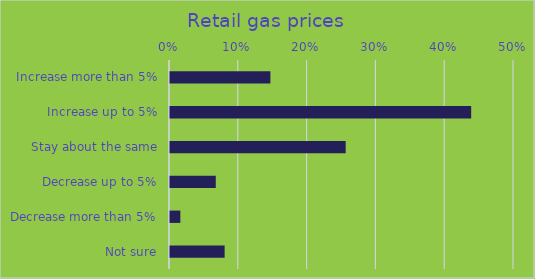
| Category | Series 0 |
|---|---|
| Increase more than 5% | 0.146 |
| Increase up to 5% | 0.438 |
| Stay about the same | 0.255 |
| Decrease up to 5% | 0.067 |
| Decrease more than 5% | 0.015 |
| Not sure | 0.079 |